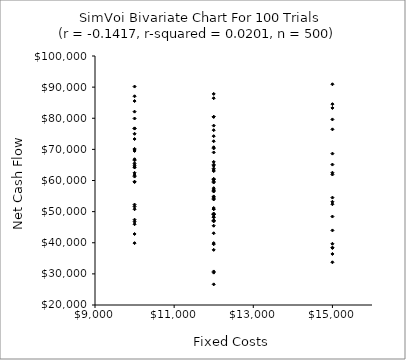
| Category | Series 0 |
|---|---|
| 12000.0 | 48154.977 |
| 12000.0 | 70682.516 |
| 12000.0 | 86436.542 |
| 10000.0 | 66834.482 |
| 12000.0 | 77634.784 |
| 15000.0 | 61919.692 |
| 10000.0 | 70156.49 |
| 10000.0 | 90184.727 |
| 10000.0 | 47412.031 |
| 12000.0 | 47153.823 |
| 12000.0 | 70315.161 |
| 12000.0 | 54893.189 |
| 12000.0 | 59352.218 |
| 15000.0 | 43958.341 |
| 12000.0 | 57531.764 |
| 15000.0 | 33721.525 |
| 10000.0 | 39877.598 |
| 12000.0 | 56752.994 |
| 12000.0 | 72608.133 |
| 15000.0 | 38446.169 |
| 12000.0 | 60314.183 |
| 10000.0 | 69834.565 |
| 10000.0 | 64337.299 |
| 12000.0 | 47130.569 |
| 15000.0 | 38325.851 |
| 12000.0 | 54219.643 |
| 12000.0 | 48262.903 |
| 12000.0 | 63352.325 |
| 12000.0 | 60252.798 |
| 12000.0 | 76166.652 |
| 10000.0 | 76750.597 |
| 12000.0 | 69012.145 |
| 10000.0 | 79919.617 |
| 15000.0 | 62504.389 |
| 15000.0 | 65119.808 |
| 10000.0 | 61264.208 |
| 12000.0 | 30782.138 |
| 12000.0 | 51160.156 |
| 12000.0 | 43050.604 |
| 12000.0 | 39518.392 |
| 15000.0 | 54506.837 |
| 12000.0 | 49043.354 |
| 15000.0 | 90921.868 |
| 12000.0 | 74244.306 |
| 12000.0 | 37711.497 |
| 12000.0 | 53905.237 |
| 10000.0 | 82120.994 |
| 12000.0 | 65974.258 |
| 10000.0 | 52260.231 |
| 12000.0 | 26633.522 |
| 10000.0 | 66494.181 |
| 15000.0 | 83312.582 |
| 12000.0 | 59711.915 |
| 12000.0 | 50778.428 |
| 15000.0 | 52375.896 |
| 10000.0 | 59511.311 |
| 12000.0 | 30399.982 |
| 12000.0 | 50832.575 |
| 12000.0 | 56965.683 |
| 10000.0 | 75000.899 |
| 15000.0 | 36397.464 |
| 10000.0 | 64164.308 |
| 15000.0 | 53162.491 |
| 10000.0 | 76683.565 |
| 12000.0 | 80473.889 |
| 15000.0 | 84532.355 |
| 12000.0 | 46867.553 |
| 15000.0 | 39668.014 |
| 10000.0 | 69491.076 |
| 15000.0 | 48421.043 |
| 10000.0 | 59624.231 |
| 10000.0 | 45949.343 |
| 10000.0 | 42811.344 |
| 10000.0 | 85524.032 |
| 12000.0 | 56458.652 |
| 10000.0 | 61718.995 |
| 12000.0 | 45467.778 |
| 10000.0 | 64909.654 |
| 12000.0 | 49068.584 |
| 12000.0 | 63024.923 |
| 15000.0 | 76433.511 |
| 10000.0 | 51620.015 |
| 12000.0 | 39893.698 |
| 10000.0 | 62462.529 |
| 15000.0 | 79619.578 |
| 12000.0 | 87814.651 |
| 12000.0 | 54668.487 |
| 12000.0 | 65126.774 |
| 12000.0 | 63850.068 |
| 10000.0 | 46750.599 |
| 10000.0 | 87060.518 |
| 12000.0 | 80461.872 |
| 10000.0 | 50763.754 |
| 12000.0 | 49094.751 |
| 15000.0 | 68637.506 |
| 12000.0 | 64732.779 |
| 10000.0 | 73323.767 |
| 12000.0 | 49394.483 |
| 12000.0 | 60547.096 |
| 10000.0 | 65516.219 |